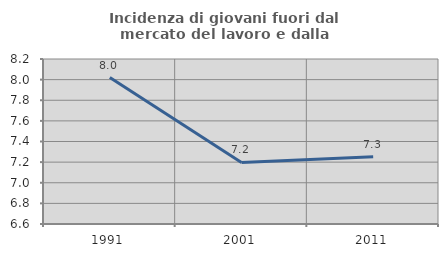
| Category | Incidenza di giovani fuori dal mercato del lavoro e dalla formazione  |
|---|---|
| 1991.0 | 8.02 |
| 2001.0 | 7.196 |
| 2011.0 | 7.251 |